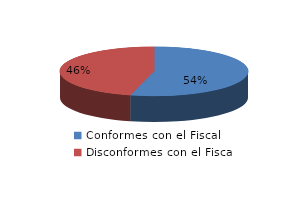
| Category | Series 0 |
|---|---|
| 0 | 27 |
| 1 | 23 |